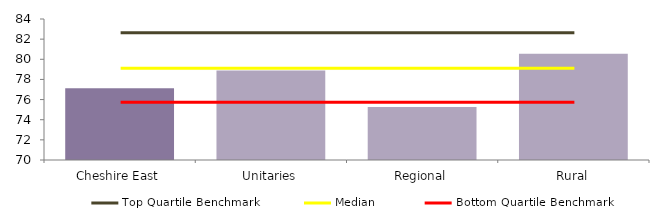
| Category | Block Data |
|---|---|
| Cheshire East | 77.112 |
| Unitaries | 78.886 |
| Regional | 75.251 |
|  Rural  | 80.555 |